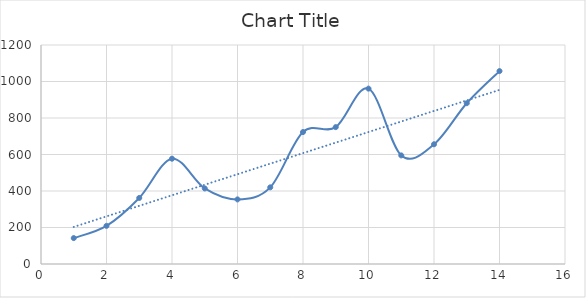
| Category | Series 0 |
|---|---|
| 0 | 142 |
| 1 | 209 |
| 2 | 362 |
| 3 | 577 |
| 4 | 414 |
| 5 | 354 |
| 6 | 420 |
| 7 | 723 |
| 8 | 750 |
| 9 | 961 |
| 10 | 595 |
| 11 | 656 |
| 12 | 881 |
| 13 | 1057 |